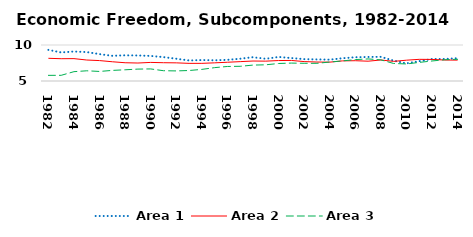
| Category | Area 1 | Area 2 | Area 3 |
|---|---|---|---|
| 1982.0 | 9.323 | 8.153 | 5.785 |
| 1983.0 | 8.968 | 8.096 | 5.788 |
| 1984.0 | 9.097 | 8.107 | 6.297 |
| 1985.0 | 9.017 | 7.914 | 6.418 |
| 1986.0 | 8.732 | 7.834 | 6.328 |
| 1987.0 | 8.501 | 7.673 | 6.472 |
| 1988.0 | 8.566 | 7.537 | 6.557 |
| 1989.0 | 8.548 | 7.496 | 6.653 |
| 1990.0 | 8.48 | 7.581 | 6.677 |
| 1991.0 | 8.321 | 7.54 | 6.43 |
| 1992.0 | 8.092 | 7.52 | 6.401 |
| 1993.0 | 7.853 | 7.448 | 6.457 |
| 1994.0 | 7.909 | 7.451 | 6.613 |
| 1995.0 | 7.873 | 7.523 | 6.856 |
| 1996.0 | 7.936 | 7.602 | 7.018 |
| 1997.0 | 8.097 | 7.689 | 7.041 |
| 1998.0 | 8.303 | 7.776 | 7.209 |
| 1999.0 | 8.086 | 7.756 | 7.25 |
| 2000.0 | 8.339 | 7.843 | 7.431 |
| 2001.0 | 8.188 | 7.856 | 7.489 |
| 2002.0 | 8.036 | 7.697 | 7.459 |
| 2003.0 | 8 | 7.633 | 7.454 |
| 2004.0 | 7.964 | 7.619 | 7.635 |
| 2005.0 | 8.157 | 7.794 | 7.788 |
| 2006.0 | 8.306 | 7.818 | 7.976 |
| 2007.0 | 8.336 | 7.752 | 8.065 |
| 2008.0 | 8.357 | 7.919 | 7.938 |
| 2009.0 | 7.828 | 7.728 | 7.434 |
| 2010.0 | 7.449 | 7.89 | 7.367 |
| 2011.0 | 7.752 | 8.01 | 7.582 |
| 2012.0 | 8.05 | 7.997 | 7.781 |
| 2013.0 | 8.061 | 7.914 | 7.953 |
| 2014.0 | 8.169 | 7.901 | 8.016 |